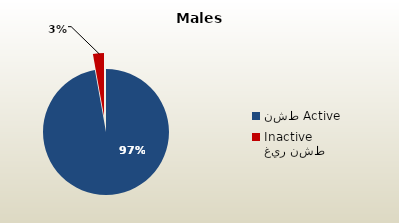
| Category | الذكور غير القطريين  Non-Qatari Males |
|---|---|
| نشط Active | 1717316 |
| غير نشط Inactive | 49904 |